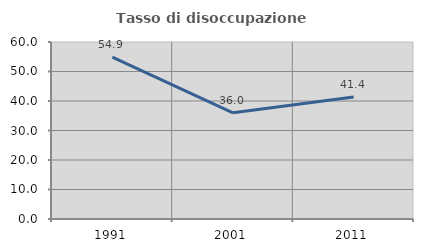
| Category | Tasso di disoccupazione giovanile  |
|---|---|
| 1991.0 | 54.867 |
| 2001.0 | 36 |
| 2011.0 | 41.379 |